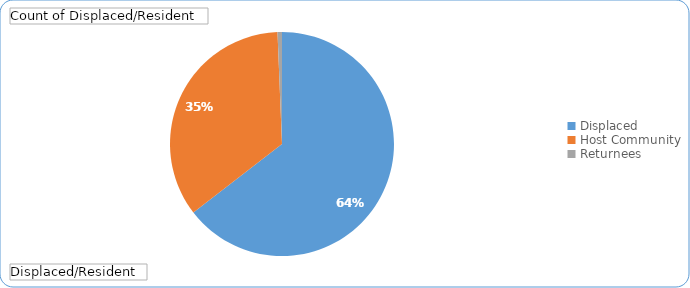
| Category | Total |
|---|---|
| Displaced | 302 |
| Host Community | 163 |
| Returnees | 3 |